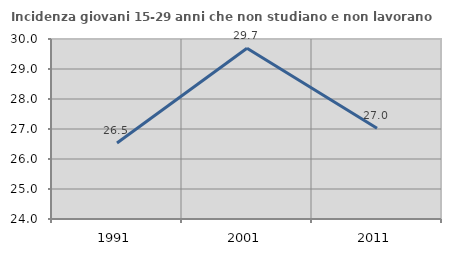
| Category | Incidenza giovani 15-29 anni che non studiano e non lavorano  |
|---|---|
| 1991.0 | 26.531 |
| 2001.0 | 29.694 |
| 2011.0 | 27.027 |